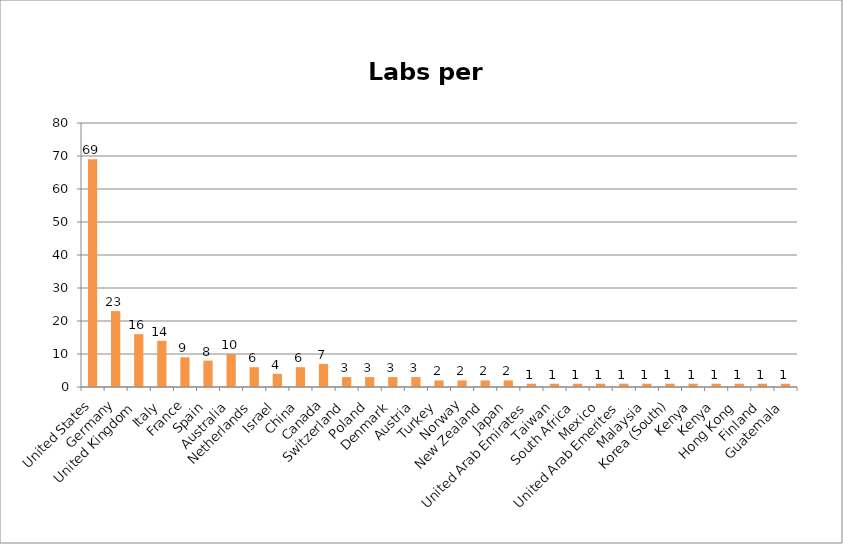
| Category | Series 0 |
|---|---|
| United States | 69 |
| Germany | 23 |
| United Kingdom | 16 |
| Italy | 14 |
| France | 9 |
| Spain | 8 |
| Australia | 10 |
| Netherlands | 6 |
| Israel | 4 |
| China | 6 |
| Canada | 7 |
| Switzerland | 3 |
| Poland | 3 |
| Denmark | 3 |
| Austria | 3 |
| Turkey | 2 |
| Norway | 2 |
| New Zealand | 2 |
| Japan | 2 |
| United Arab Emirates | 1 |
| Taiwan | 1 |
| South Africa | 1 |
| Mexico | 1 |
| United Arab Emerites | 1 |
| Malaysia | 1 |
| Korea (South) | 1 |
| Kenya | 1 |
| Kenya | 1 |
| Hong Kong | 1 |
| Finland | 1 |
| Guatemala | 1 |